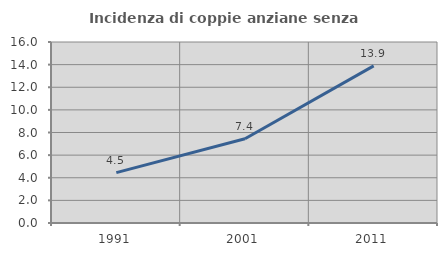
| Category | Incidenza di coppie anziane senza figli  |
|---|---|
| 1991.0 | 4.455 |
| 2001.0 | 7.441 |
| 2011.0 | 13.893 |